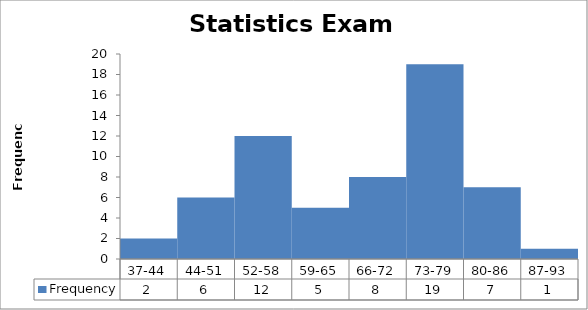
| Category | Frequency |
|---|---|
| 37-44 | 2 |
| 44-51 | 6 |
| 52-58 | 12 |
| 59-65 | 5 |
| 66-72 | 8 |
| 73-79 | 19 |
| 80-86 | 7 |
| 87-93 | 1 |